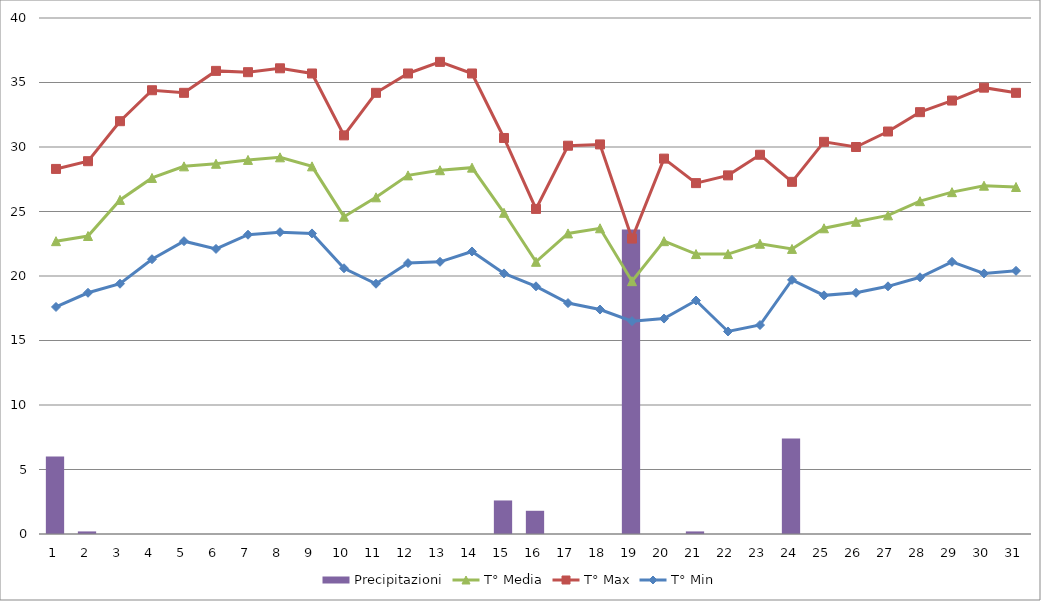
| Category | Precipitazioni |
|---|---|
| 0 | 6 |
| 1 | 0.2 |
| 2 | 0 |
| 3 | 0 |
| 4 | 0 |
| 5 | 0 |
| 6 | 0 |
| 7 | 0 |
| 8 | 0 |
| 9 | 0 |
| 10 | 0 |
| 11 | 0 |
| 12 | 0 |
| 13 | 0 |
| 14 | 2.6 |
| 15 | 1.8 |
| 16 | 0 |
| 17 | 0 |
| 18 | 23.6 |
| 19 | 0 |
| 20 | 0.2 |
| 21 | 0 |
| 22 | 0 |
| 23 | 7.4 |
| 24 | 0 |
| 25 | 0 |
| 26 | 0 |
| 27 | 0 |
| 28 | 0 |
| 29 | 0 |
| 30 | 0 |